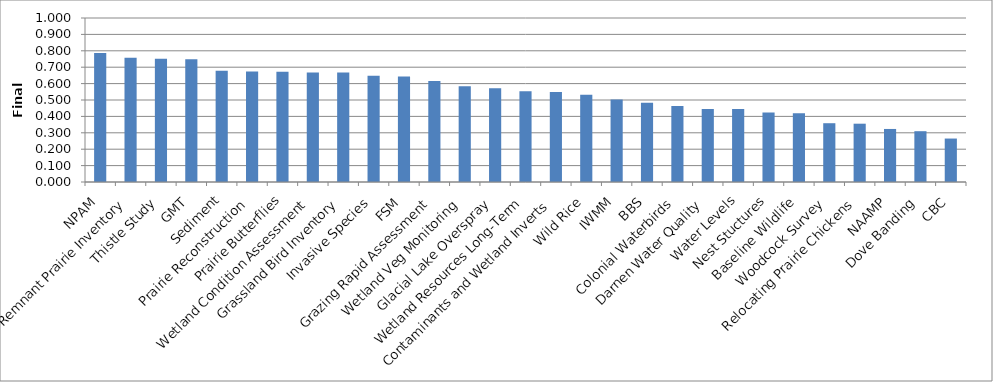
| Category | Series 0 |
|---|---|
| NPAM | 0.787 |
| Remnant Prairie Inventory | 0.758 |
| Thistle Study | 0.752 |
| GMT | 0.748 |
| Sediment | 0.679 |
| Prairie Reconstruction | 0.674 |
| Prairie Butterflies | 0.672 |
| Wetland Condition Assessment | 0.668 |
| Grassland Bird Inventory | 0.668 |
| Invasive Species | 0.649 |
| FSM | 0.643 |
| Grazing Rapid Assessment | 0.616 |
| Wetland Veg Monitoring | 0.584 |
| Glacial Lake Overspray | 0.572 |
| Wetland Resources Long-Term | 0.553 |
| Contaminants and Wetland Inverts | 0.548 |
| Wild Rice | 0.533 |
| IWMM | 0.503 |
| BBS | 0.483 |
| Colonial Waterbirds | 0.464 |
| Darnen Water Quality | 0.445 |
| Water Levels | 0.445 |
| Nest Stuctures | 0.424 |
| Baseline Wildlife | 0.419 |
| Woodcock Survey | 0.358 |
| Relocating Prairie Chickens | 0.356 |
| NAAMP | 0.323 |
| Dove Banding | 0.31 |
| CBC | 0.265 |